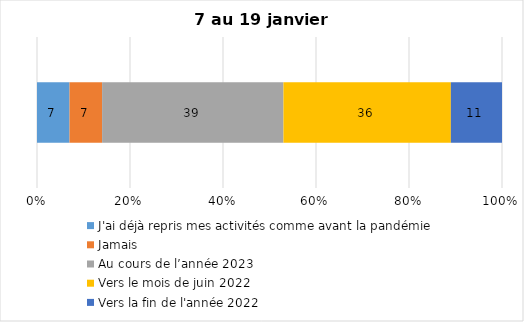
| Category | J'ai déjà repris mes activités comme avant la pandémie | Jamais | Au cours de l’année 2023 | Vers le mois de juin 2022 | Vers la fin de l'année 2022 |
|---|---|---|---|---|---|
| 0 | 7 | 7 | 39 | 36 | 11 |